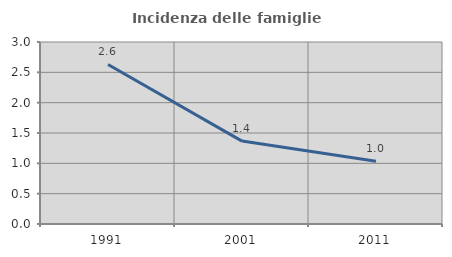
| Category | Incidenza delle famiglie numerose |
|---|---|
| 1991.0 | 2.629 |
| 2001.0 | 1.366 |
| 2011.0 | 1.034 |